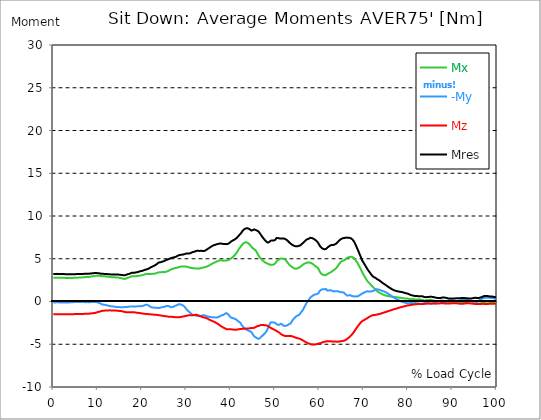
| Category |  Mx |  -My |  Mz |  Mres |
|---|---|---|---|---|
| 0.0 | 2.785 | -0.117 | -1.502 | 3.225 |
| 0.167348456675344 | 2.785 | -0.117 | -1.496 | 3.225 |
| 0.334696913350688 | 2.791 | -0.123 | -1.489 | 3.225 |
| 0.5020453700260321 | 2.791 | -0.11 | -1.489 | 3.225 |
| 0.669393826701376 | 2.791 | -0.097 | -1.496 | 3.231 |
| 0.83674228337672 | 2.791 | -0.097 | -1.496 | 3.231 |
| 1.0040907400520642 | 2.791 | -0.097 | -1.496 | 3.225 |
| 1.1621420602454444 | 2.791 | -0.104 | -1.489 | 3.225 |
| 1.3294905169207885 | 2.791 | -0.11 | -1.489 | 3.225 |
| 1.4968389735961325 | 2.791 | -0.11 | -1.489 | 3.225 |
| 1.6641874302714765 | 2.791 | -0.104 | -1.489 | 3.225 |
| 1.8315358869468206 | 2.778 | -0.104 | -1.496 | 3.218 |
| 1.9988843436221646 | 2.772 | -0.11 | -1.496 | 3.212 |
| 2.1662328002975086 | 2.772 | -0.117 | -1.489 | 3.212 |
| 2.333581256972853 | 2.772 | -0.123 | -1.483 | 3.206 |
| 2.5009297136481967 | 2.765 | -0.11 | -1.489 | 3.206 |
| 2.6682781703235405 | 2.759 | -0.104 | -1.489 | 3.199 |
| 2.8356266269988843 | 2.759 | -0.11 | -1.489 | 3.199 |
| 3.002975083674229 | 2.759 | -0.117 | -1.489 | 3.199 |
| 3.1703235403495724 | 2.759 | -0.117 | -1.489 | 3.199 |
| 3.337671997024917 | 2.759 | -0.11 | -1.489 | 3.193 |
| 3.4957233172182973 | 2.752 | -0.104 | -1.489 | 3.193 |
| 3.663071773893641 | 2.759 | -0.104 | -1.483 | 3.186 |
| 3.8304202305689854 | 2.752 | -0.097 | -1.483 | 3.186 |
| 3.997768687244329 | 2.752 | -0.084 | -1.483 | 3.186 |
| 4.165117143919673 | 2.752 | -0.078 | -1.483 | 3.186 |
| 4.332465600595017 | 2.759 | -0.078 | -1.483 | 3.193 |
| 4.499814057270361 | 2.772 | -0.071 | -1.476 | 3.199 |
| 4.667162513945706 | 2.772 | -0.071 | -1.476 | 3.199 |
| 4.834510970621049 | 2.778 | -0.071 | -1.47 | 3.199 |
| 5.001859427296393 | 2.785 | -0.071 | -1.47 | 3.199 |
| 5.169207883971737 | 2.785 | -0.065 | -1.464 | 3.206 |
| 5.336556340647081 | 2.785 | -0.058 | -1.464 | 3.206 |
| 5.503904797322425 | 2.791 | -0.052 | -1.47 | 3.212 |
| 5.671253253997769 | 2.798 | -0.052 | -1.47 | 3.218 |
| 5.82930457419115 | 2.804 | -0.058 | -1.464 | 3.218 |
| 5.996653030866494 | 2.804 | -0.058 | -1.464 | 3.218 |
| 6.164001487541838 | 2.811 | -0.065 | -1.457 | 3.218 |
| 6.331349944217181 | 2.817 | -0.065 | -1.451 | 3.218 |
| 6.498698400892526 | 2.817 | -0.065 | -1.451 | 3.225 |
| 6.66604685756787 | 2.823 | -0.065 | -1.451 | 3.225 |
| 6.833395314243213 | 2.83 | -0.071 | -1.451 | 3.231 |
| 7.000743770918558 | 2.843 | -0.071 | -1.444 | 3.238 |
| 7.168092227593902 | 2.849 | -0.078 | -1.438 | 3.238 |
| 7.335440684269246 | 2.856 | -0.078 | -1.431 | 3.238 |
| 7.50278914094459 | 2.856 | -0.078 | -1.431 | 3.244 |
| 7.6701375976199335 | 2.869 | -0.071 | -1.431 | 3.251 |
| 7.837486054295278 | 2.875 | -0.078 | -1.425 | 3.251 |
| 7.995537374488658 | 2.875 | -0.078 | -1.425 | 3.251 |
| 8.162885831164003 | 2.888 | -0.078 | -1.418 | 3.257 |
| 8.330234287839346 | 2.901 | -0.078 | -1.405 | 3.27 |
| 8.49758274451469 | 2.914 | -0.071 | -1.399 | 3.277 |
| 8.664931201190035 | 2.934 | -0.065 | -1.386 | 3.29 |
| 8.832279657865378 | 2.947 | -0.065 | -1.373 | 3.303 |
| 8.999628114540721 | 2.959 | -0.052 | -1.366 | 3.309 |
| 9.166976571216066 | 2.979 | -0.058 | -1.353 | 3.322 |
| 9.334325027891412 | 2.992 | -0.065 | -1.341 | 3.329 |
| 9.501673484566755 | 3.005 | -0.071 | -1.321 | 3.335 |
| 9.669021941242098 | 3.018 | -0.071 | -1.302 | 3.342 |
| 9.836370397917442 | 3.011 | -0.104 | -1.263 | 3.316 |
| 10.003718854592787 | 3.011 | -0.123 | -1.23 | 3.309 |
| 10.17106731126813 | 3.011 | -0.142 | -1.217 | 3.303 |
| 10.329118631461512 | 3.011 | -0.149 | -1.205 | 3.303 |
| 10.496467088136853 | 3.005 | -0.188 | -1.172 | 3.283 |
| 10.663815544812199 | 2.979 | -0.253 | -1.14 | 3.257 |
| 10.831164001487544 | 2.959 | -0.304 | -1.107 | 3.238 |
| 10.998512458162887 | 2.953 | -0.337 | -1.094 | 3.231 |
| 11.16586091483823 | 2.953 | -0.356 | -1.081 | 3.231 |
| 11.333209371513574 | 2.953 | -0.369 | -1.075 | 3.231 |
| 11.50055782818892 | 2.947 | -0.389 | -1.069 | 3.231 |
| 11.667906284864264 | 2.94 | -0.402 | -1.062 | 3.225 |
| 11.835254741539607 | 2.927 | -0.421 | -1.056 | 3.212 |
| 12.00260319821495 | 2.921 | -0.44 | -1.049 | 3.206 |
| 12.169951654890292 | 2.908 | -0.466 | -1.043 | 3.199 |
| 12.337300111565641 | 2.901 | -0.479 | -1.043 | 3.199 |
| 12.504648568240984 | 2.895 | -0.499 | -1.036 | 3.193 |
| 12.662699888434362 | 2.875 | -0.525 | -1.036 | 3.18 |
| 12.830048345109708 | 2.862 | -0.544 | -1.036 | 3.173 |
| 12.997396801785053 | 2.849 | -0.557 | -1.043 | 3.167 |
| 13.164745258460396 | 2.843 | -0.563 | -1.043 | 3.16 |
| 13.33209371513574 | 2.836 | -0.57 | -1.043 | 3.16 |
| 13.499442171811083 | 2.83 | -0.576 | -1.043 | 3.154 |
| 13.666790628486426 | 2.83 | -0.589 | -1.043 | 3.16 |
| 13.834139085161771 | 2.823 | -0.609 | -1.049 | 3.16 |
| 14.001487541837117 | 2.823 | -0.628 | -1.056 | 3.16 |
| 14.16883599851246 | 2.811 | -0.648 | -1.062 | 3.16 |
| 14.336184455187803 | 2.798 | -0.654 | -1.075 | 3.154 |
| 14.503532911863147 | 2.791 | -0.661 | -1.081 | 3.154 |
| 14.670881368538492 | 2.791 | -0.648 | -1.088 | 3.147 |
| 14.828932688731873 | 2.778 | -0.661 | -1.094 | 3.141 |
| 14.996281145407215 | 2.759 | -0.667 | -1.107 | 3.134 |
| 15.163629602082558 | 2.739 | -0.667 | -1.114 | 3.121 |
| 15.330978058757903 | 2.72 | -0.667 | -1.127 | 3.108 |
| 15.498326515433247 | 2.7 | -0.667 | -1.14 | 3.095 |
| 15.665674972108594 | 2.675 | -0.667 | -1.159 | 3.089 |
| 15.833023428783937 | 2.655 | -0.661 | -1.185 | 3.076 |
| 16.00037188545928 | 2.642 | -0.654 | -1.211 | 3.063 |
| 16.167720342134626 | 2.636 | -0.648 | -1.23 | 3.07 |
| 16.335068798809967 | 2.662 | -0.654 | -1.243 | 3.095 |
| 16.502417255485312 | 2.713 | -0.635 | -1.25 | 3.134 |
| 16.669765712160658 | 2.765 | -0.635 | -1.256 | 3.18 |
| 16.837114168836 | 2.791 | -0.615 | -1.263 | 3.199 |
| 17.004462625511344 | 2.804 | -0.602 | -1.263 | 3.212 |
| 17.16251394570472 | 2.836 | -0.596 | -1.263 | 3.238 |
| 17.32986240238007 | 2.875 | -0.596 | -1.263 | 3.277 |
| 17.497210859055414 | 2.914 | -0.589 | -1.256 | 3.316 |
| 17.664559315730756 | 2.947 | -0.596 | -1.25 | 3.348 |
| 17.8319077724061 | 2.947 | -0.596 | -1.25 | 3.354 |
| 17.999256229081443 | 2.947 | -0.589 | -1.25 | 3.354 |
| 18.166604685756788 | 2.94 | -0.57 | -1.256 | 3.348 |
| 18.333953142432133 | 2.947 | -0.576 | -1.269 | 3.367 |
| 18.501301599107478 | 2.959 | -0.583 | -1.289 | 3.393 |
| 18.668650055782823 | 2.966 | -0.583 | -1.302 | 3.413 |
| 18.835998512458165 | 2.972 | -0.563 | -1.302 | 3.419 |
| 19.00334696913351 | 2.979 | -0.55 | -1.315 | 3.432 |
| 19.170695425808855 | 2.998 | -0.55 | -1.328 | 3.458 |
| 19.338043882484197 | 3.018 | -0.557 | -1.347 | 3.497 |
| 19.496095202677576 | 3.031 | -0.563 | -1.36 | 3.529 |
| 19.66344365935292 | 3.044 | -0.55 | -1.366 | 3.549 |
| 19.830792116028263 | 3.057 | -0.537 | -1.379 | 3.568 |
| 19.998140572703612 | 3.07 | -0.525 | -1.392 | 3.581 |
| 20.165489029378953 | 3.083 | -0.518 | -1.405 | 3.607 |
| 20.3328374860543 | 3.115 | -0.499 | -1.425 | 3.639 |
| 20.500185942729644 | 3.141 | -0.447 | -1.444 | 3.665 |
| 20.667534399404985 | 3.186 | -0.408 | -1.444 | 3.704 |
| 20.83488285608033 | 3.199 | -0.389 | -1.457 | 3.73 |
| 21.002231312755672 | 3.212 | -0.369 | -1.464 | 3.756 |
| 21.16957976943102 | 3.225 | -0.369 | -1.47 | 3.769 |
| 21.336928226106362 | 3.225 | -0.414 | -1.476 | 3.808 |
| 21.504276682781704 | 3.225 | -0.466 | -1.489 | 3.847 |
| 21.67162513945705 | 3.225 | -0.531 | -1.489 | 3.898 |
| 21.82967645965043 | 3.231 | -0.596 | -1.489 | 3.95 |
| 21.997024916325774 | 3.225 | -0.661 | -1.502 | 4.009 |
| 22.16437337300112 | 3.231 | -0.706 | -1.509 | 4.06 |
| 22.33172182967646 | 3.238 | -0.693 | -1.515 | 4.08 |
| 22.499070286351806 | 3.244 | -0.686 | -1.528 | 4.112 |
| 22.666418743027148 | 3.244 | -0.719 | -1.541 | 4.164 |
| 22.833767199702496 | 3.244 | -0.745 | -1.554 | 4.209 |
| 23.00111565637784 | 3.27 | -0.745 | -1.561 | 4.261 |
| 23.168464113053183 | 3.309 | -0.738 | -1.561 | 4.319 |
| 23.335812569728528 | 3.348 | -0.725 | -1.561 | 4.371 |
| 23.50316102640387 | 3.374 | -0.751 | -1.58 | 4.455 |
| 23.670509483079215 | 3.393 | -0.771 | -1.6 | 4.533 |
| 23.83785793975456 | 3.413 | -0.758 | -1.606 | 4.572 |
| 23.995909259947936 | 3.419 | -0.738 | -1.612 | 4.578 |
| 24.163257716623285 | 3.419 | -0.712 | -1.625 | 4.591 |
| 24.330606173298627 | 3.419 | -0.68 | -1.638 | 4.611 |
| 24.49795462997397 | 3.432 | -0.654 | -1.658 | 4.63 |
| 24.665303086649313 | 3.445 | -0.654 | -1.677 | 4.676 |
| 24.83265154332466 | 3.432 | -0.641 | -1.69 | 4.708 |
| 25.0 | 3.426 | -0.635 | -1.71 | 4.734 |
| 25.167348456675345 | 3.445 | -0.609 | -1.716 | 4.773 |
| 25.334696913350694 | 3.465 | -0.544 | -1.716 | 4.818 |
| 25.502045370026035 | 3.49 | -0.518 | -1.729 | 4.863 |
| 25.669393826701377 | 3.523 | -0.531 | -1.742 | 4.902 |
| 25.836742283376722 | 3.555 | -0.525 | -1.761 | 4.922 |
| 26.004090740052067 | 3.594 | -0.531 | -1.781 | 4.941 |
| 26.17143919672741 | 3.633 | -0.563 | -1.774 | 4.961 |
| 26.329490516920792 | 3.704 | -0.628 | -1.787 | 5.038 |
| 26.49683897359613 | 3.75 | -0.661 | -1.794 | 5.071 |
| 26.66418743027148 | 3.769 | -0.68 | -1.794 | 5.084 |
| 26.831535886946828 | 3.795 | -0.686 | -1.794 | 5.116 |
| 26.998884343622166 | 3.834 | -0.641 | -1.8 | 5.148 |
| 27.166232800297514 | 3.866 | -0.57 | -1.82 | 5.161 |
| 27.333581256972852 | 3.892 | -0.525 | -1.826 | 5.181 |
| 27.5009297136482 | 3.911 | -0.492 | -1.833 | 5.207 |
| 27.668278170323543 | 3.931 | -0.479 | -1.839 | 5.232 |
| 27.835626626998888 | 3.957 | -0.46 | -1.839 | 5.284 |
| 28.002975083674233 | 3.963 | -0.389 | -1.839 | 5.336 |
| 28.170323540349575 | 3.989 | -0.343 | -1.839 | 5.381 |
| 28.33767199702492 | 4.022 | -0.317 | -1.833 | 5.42 |
| 28.50502045370026 | 4.054 | -0.311 | -1.826 | 5.44 |
| 28.663071773893645 | 4.073 | -0.33 | -1.813 | 5.453 |
| 28.830420230568986 | 4.086 | -0.356 | -1.8 | 5.466 |
| 28.99776868724433 | 4.099 | -0.402 | -1.787 | 5.479 |
| 29.165117143919673 | 4.106 | -0.447 | -1.768 | 5.492 |
| 29.33246560059502 | 4.099 | -0.486 | -1.748 | 5.498 |
| 29.499814057270367 | 4.099 | -0.576 | -1.729 | 5.524 |
| 29.66716251394571 | 4.099 | -0.648 | -1.71 | 5.55 |
| 29.834510970621054 | 4.086 | -0.751 | -1.69 | 5.569 |
| 30.00185942729639 | 4.073 | -0.881 | -1.677 | 5.621 |
| 30.169207883971744 | 4.054 | -0.984 | -1.658 | 5.634 |
| 30.33655634064708 | 4.041 | -1.081 | -1.632 | 5.628 |
| 30.50390479732243 | 4.009 | -1.179 | -1.612 | 5.615 |
| 30.671253253997772 | 3.983 | -1.237 | -1.6 | 5.608 |
| 30.829304574191156 | 3.957 | -1.289 | -1.593 | 5.621 |
| 30.996653030866494 | 3.931 | -1.379 | -1.6 | 5.673 |
| 31.164001487541842 | 3.911 | -1.47 | -1.606 | 5.725 |
| 31.331349944217187 | 3.905 | -1.541 | -1.606 | 5.764 |
| 31.498698400892525 | 3.898 | -1.574 | -1.6 | 5.789 |
| 31.666046857567874 | 3.886 | -1.6 | -1.587 | 5.809 |
| 31.833395314243212 | 3.879 | -1.625 | -1.587 | 5.841 |
| 32.00074377091856 | 3.873 | -1.612 | -1.567 | 5.861 |
| 32.1680922275939 | 3.873 | -1.632 | -1.554 | 5.887 |
| 32.33544068426925 | 3.873 | -1.671 | -1.548 | 5.925 |
| 32.50278914094459 | 3.86 | -1.69 | -1.587 | 5.932 |
| 32.670137597619934 | 3.847 | -1.697 | -1.632 | 5.932 |
| 32.83748605429528 | 3.86 | -1.664 | -1.671 | 5.919 |
| 33.004834510970625 | 3.873 | -1.651 | -1.703 | 5.912 |
| 33.162885831164004 | 3.892 | -1.664 | -1.736 | 5.919 |
| 33.33023428783935 | 3.911 | -1.71 | -1.748 | 5.938 |
| 33.497582744514695 | 3.937 | -1.671 | -1.787 | 5.925 |
| 33.664931201190036 | 3.957 | -1.606 | -1.826 | 5.899 |
| 33.83227965786538 | 3.976 | -1.606 | -1.846 | 5.906 |
| 33.99962811454073 | 3.996 | -1.6 | -1.872 | 5.906 |
| 34.16697657121607 | 4.015 | -1.619 | -1.891 | 5.938 |
| 34.33432502789141 | 4.034 | -1.658 | -1.91 | 5.984 |
| 34.50167348456676 | 4.067 | -1.703 | -1.943 | 6.042 |
| 34.6690219412421 | 4.099 | -1.736 | -1.975 | 6.094 |
| 34.83637039791744 | 4.138 | -1.748 | -2.033 | 6.139 |
| 35.00371885459279 | 4.183 | -1.774 | -2.072 | 6.21 |
| 35.17106731126814 | 4.229 | -1.781 | -2.118 | 6.256 |
| 35.338415767943474 | 4.274 | -1.8 | -2.156 | 6.32 |
| 35.49646708813686 | 4.326 | -1.82 | -2.195 | 6.385 |
| 35.6638155448122 | 4.371 | -1.833 | -2.241 | 6.443 |
| 35.831164001487544 | 4.423 | -1.846 | -2.286 | 6.495 |
| 35.998512458162885 | 4.468 | -1.852 | -2.318 | 6.541 |
| 36.165860914838234 | 4.514 | -1.852 | -2.357 | 6.579 |
| 36.333209371513576 | 4.553 | -1.859 | -2.39 | 6.605 |
| 36.50055782818892 | 4.591 | -1.865 | -2.428 | 6.625 |
| 36.667906284864266 | 4.63 | -1.865 | -2.48 | 6.657 |
| 36.83525474153961 | 4.676 | -1.878 | -2.532 | 6.69 |
| 37.002603198214956 | 4.714 | -1.865 | -2.59 | 6.722 |
| 37.1699516548903 | 4.747 | -1.826 | -2.642 | 6.741 |
| 37.337300111565646 | 4.779 | -1.787 | -2.7 | 6.761 |
| 37.50464856824098 | 4.805 | -1.768 | -2.759 | 6.774 |
| 37.66269988843437 | 4.831 | -1.703 | -2.83 | 6.78 |
| 37.83004834510971 | 4.837 | -1.658 | -2.888 | 6.78 |
| 37.99739680178505 | 4.825 | -1.606 | -2.94 | 6.761 |
| 38.16474525846039 | 4.786 | -1.593 | -3.005 | 6.754 |
| 38.33209371513574 | 4.76 | -1.58 | -3.044 | 6.735 |
| 38.49944217181109 | 4.766 | -1.528 | -3.076 | 6.735 |
| 38.666790628486424 | 4.792 | -1.444 | -3.128 | 6.715 |
| 38.83413908516178 | 4.799 | -1.373 | -3.18 | 6.696 |
| 39.001487541837115 | 4.799 | -1.36 | -3.225 | 6.709 |
| 39.16883599851246 | 4.812 | -1.373 | -3.238 | 6.709 |
| 39.336184455187805 | 4.825 | -1.457 | -3.251 | 6.728 |
| 39.503532911863154 | 4.844 | -1.535 | -3.264 | 6.754 |
| 39.670881368538495 | 4.896 | -1.645 | -3.257 | 6.826 |
| 39.83822982521384 | 4.967 | -1.768 | -3.238 | 6.923 |
| 39.996281145407224 | 5.019 | -1.846 | -3.238 | 6.981 |
| 40.163629602082565 | 5.077 | -1.897 | -3.251 | 7.039 |
| 40.33097805875791 | 5.142 | -1.936 | -3.27 | 7.091 |
| 40.498326515433256 | 5.213 | -1.949 | -3.283 | 7.136 |
| 40.6656749721086 | 5.291 | -1.975 | -3.283 | 7.182 |
| 40.83302342878393 | 5.381 | -2.014 | -3.296 | 7.24 |
| 41.00037188545929 | 5.466 | -2.027 | -3.303 | 7.285 |
| 41.16772034213463 | 5.569 | -2.079 | -3.309 | 7.35 |
| 41.33506879880997 | 5.692 | -2.15 | -3.296 | 7.421 |
| 41.50241725548531 | 5.828 | -2.221 | -3.283 | 7.506 |
| 41.66976571216066 | 5.971 | -2.292 | -3.257 | 7.609 |
| 41.837114168836 | 6.113 | -2.357 | -3.238 | 7.706 |
| 42.004462625511344 | 6.236 | -2.441 | -3.231 | 7.803 |
| 42.17181108218669 | 6.353 | -2.474 | -3.212 | 7.881 |
| 42.32986240238007 | 6.463 | -2.571 | -3.206 | 7.985 |
| 42.497210859055414 | 6.586 | -2.765 | -3.212 | 8.127 |
| 42.66455931573076 | 6.703 | -2.875 | -3.199 | 8.257 |
| 42.831907772406105 | 6.78 | -2.979 | -3.199 | 8.347 |
| 42.999256229081446 | 6.838 | -3.057 | -3.193 | 8.419 |
| 43.16660468575679 | 6.89 | -3.121 | -3.186 | 8.49 |
| 43.33395314243214 | 6.936 | -3.173 | -3.18 | 8.542 |
| 43.50130159910748 | 6.936 | -3.251 | -3.173 | 8.561 |
| 43.66865005578282 | 6.903 | -3.316 | -3.167 | 8.568 |
| 43.83599851245817 | 6.858 | -3.374 | -3.154 | 8.555 |
| 44.00334696913351 | 6.806 | -3.413 | -3.154 | 8.535 |
| 44.17069542580886 | 6.728 | -3.445 | -3.141 | 8.49 |
| 44.3380438824842 | 6.644 | -3.478 | -3.128 | 8.432 |
| 44.49609520267758 | 6.534 | -3.51 | -3.115 | 8.36 |
| 44.66344365935292 | 6.411 | -3.542 | -3.108 | 8.296 |
| 44.83079211602827 | 6.314 | -3.678 | -3.108 | 8.315 |
| 44.99814057270361 | 6.23 | -3.834 | -3.108 | 8.354 |
| 45.16548902937895 | 6.139 | -3.989 | -3.102 | 8.406 |
| 45.332837486054295 | 6.107 | -4.093 | -3.07 | 8.438 |
| 45.500185942729644 | 6.048 | -4.151 | -3.031 | 8.419 |
| 45.66753439940499 | 5.951 | -4.19 | -2.979 | 8.354 |
| 45.83488285608033 | 5.802 | -4.255 | -2.927 | 8.315 |
| 46.00223131275568 | 5.647 | -4.332 | -2.875 | 8.276 |
| 46.16957976943102 | 5.492 | -4.358 | -2.875 | 8.224 |
| 46.336928226106366 | 5.343 | -4.371 | -2.869 | 8.166 |
| 46.50427668278171 | 5.194 | -4.332 | -2.862 | 8.062 |
| 46.671625139457056 | 5.148 | -4.229 | -2.765 | 7.913 |
| 46.829676459650436 | 5.025 | -4.157 | -2.746 | 7.784 |
| 46.99702491632577 | 4.915 | -4.08 | -2.746 | 7.661 |
| 47.16437337300112 | 4.818 | -4.002 | -2.746 | 7.544 |
| 47.33172182967646 | 4.74 | -3.905 | -2.746 | 7.428 |
| 47.49907028635181 | 4.669 | -3.827 | -2.752 | 7.318 |
| 47.66641874302716 | 4.604 | -3.75 | -2.765 | 7.214 |
| 47.83376719970249 | 4.546 | -3.659 | -2.778 | 7.117 |
| 48.001115656377834 | 4.507 | -3.542 | -2.791 | 7.026 |
| 48.16846411305319 | 4.462 | -3.393 | -2.817 | 6.949 |
| 48.33581256972853 | 4.417 | -3.231 | -2.856 | 6.897 |
| 48.50316102640387 | 4.391 | -3.031 | -2.901 | 6.897 |
| 48.67050948307921 | 4.345 | -2.804 | -2.959 | 6.936 |
| 48.837857939754564 | 4.306 | -2.61 | -3.018 | 7.026 |
| 49.005206396429905 | 4.281 | -2.461 | -3.076 | 7.104 |
| 49.163257716623285 | 4.287 | -2.428 | -3.121 | 7.117 |
| 49.33060617329863 | 4.274 | -2.428 | -3.16 | 7.136 |
| 49.49795462997397 | 4.287 | -2.435 | -3.206 | 7.136 |
| 49.66530308664932 | 4.326 | -2.448 | -3.251 | 7.13 |
| 49.832651543324666 | 4.365 | -2.5 | -3.29 | 7.169 |
| 50.0 | 4.429 | -2.487 | -3.348 | 7.188 |
| 50.16734845667534 | 4.54 | -2.551 | -3.393 | 7.292 |
| 50.33469691335069 | 4.669 | -2.649 | -3.439 | 7.415 |
| 50.50204537002604 | 4.76 | -2.707 | -3.49 | 7.447 |
| 50.66939382670139 | 4.85 | -2.713 | -3.542 | 7.415 |
| 50.836742283376715 | 4.922 | -2.7 | -3.614 | 7.402 |
| 51.00409074005207 | 4.954 | -2.72 | -3.659 | 7.382 |
| 51.17143919672741 | 5.012 | -2.668 | -3.737 | 7.395 |
| 51.32949051692079 | 5.032 | -2.61 | -3.808 | 7.376 |
| 51.496838973596134 | 5.025 | -2.597 | -3.866 | 7.37 |
| 51.66418743027148 | 5.012 | -2.687 | -3.911 | 7.382 |
| 51.831535886946824 | 5.012 | -2.817 | -3.944 | 7.395 |
| 51.99888434362217 | 4.999 | -2.882 | -3.983 | 7.376 |
| 52.16623280029752 | 4.961 | -2.862 | -4.022 | 7.344 |
| 52.33358125697285 | 4.896 | -2.817 | -4.047 | 7.298 |
| 52.5009297136482 | 4.792 | -2.83 | -4.047 | 7.253 |
| 52.668278170323546 | 4.676 | -2.843 | -4.041 | 7.195 |
| 52.835626626998895 | 4.559 | -2.772 | -4.041 | 7.11 |
| 53.00297508367424 | 4.449 | -2.707 | -4.034 | 7.026 |
| 53.17032354034958 | 4.332 | -2.642 | -4.028 | 6.936 |
| 53.33767199702492 | 4.235 | -2.603 | -4.022 | 6.858 |
| 53.50502045370027 | 4.19 | -2.577 | -4.028 | 6.793 |
| 53.663071773893655 | 4.112 | -2.441 | -4.041 | 6.715 |
| 53.83042023056899 | 4.041 | -2.299 | -4.06 | 6.644 |
| 53.99776868724433 | 3.976 | -2.176 | -4.093 | 6.592 |
| 54.16511714391967 | 3.911 | -2.053 | -4.125 | 6.547 |
| 54.33246560059503 | 3.879 | -1.975 | -4.151 | 6.515 |
| 54.49981405727037 | 3.847 | -1.884 | -4.19 | 6.482 |
| 54.667162513945705 | 3.834 | -1.787 | -4.229 | 6.45 |
| 54.834510970621054 | 3.84 | -1.716 | -4.255 | 6.437 |
| 55.0018594272964 | 3.86 | -1.671 | -4.274 | 6.45 |
| 55.169207883971744 | 3.886 | -1.632 | -4.3 | 6.476 |
| 55.336556340647086 | 3.937 | -1.587 | -4.319 | 6.508 |
| 55.50390479732243 | 3.996 | -1.548 | -4.339 | 6.547 |
| 55.671253253997776 | 4.047 | -1.418 | -4.384 | 6.554 |
| 55.83860171067312 | 4.106 | -1.276 | -4.423 | 6.612 |
| 55.9966530308665 | 4.177 | -1.179 | -4.468 | 6.703 |
| 56.16400148754184 | 4.255 | -1.081 | -4.514 | 6.774 |
| 56.33134994421718 | 4.319 | -0.945 | -4.559 | 6.845 |
| 56.498698400892536 | 4.384 | -0.79 | -4.611 | 6.942 |
| 56.66604685756788 | 4.436 | -0.609 | -4.669 | 7.026 |
| 56.83339531424321 | 4.468 | -0.447 | -4.714 | 7.117 |
| 57.00074377091856 | 4.494 | -0.285 | -4.766 | 7.195 |
| 57.16809222759391 | 4.527 | -0.136 | -4.812 | 7.266 |
| 57.33544068426925 | 4.559 | -0.013 | -4.857 | 7.292 |
| 57.5027891409446 | 4.565 | 0.104 | -4.883 | 7.311 |
| 57.670137597619934 | 4.559 | 0.227 | -4.922 | 7.363 |
| 57.83748605429528 | 4.546 | 0.363 | -4.954 | 7.408 |
| 58.004834510970625 | 4.533 | 0.473 | -4.986 | 7.447 |
| 58.16288583116401 | 4.488 | 0.544 | -5.012 | 7.441 |
| 58.330234287839346 | 4.455 | 0.602 | -5.032 | 7.421 |
| 58.497582744514695 | 4.404 | 0.673 | -5.045 | 7.389 |
| 58.66493120119004 | 4.326 | 0.738 | -5.045 | 7.344 |
| 58.832279657865385 | 4.248 | 0.797 | -5.038 | 7.298 |
| 58.999628114540734 | 4.177 | 0.822 | -5.032 | 7.24 |
| 59.16697657121607 | 4.125 | 0.822 | -5.012 | 7.182 |
| 59.33432502789142 | 4.054 | 0.861 | -4.993 | 7.098 |
| 59.50167348456676 | 4.009 | 0.881 | -4.961 | 7.013 |
| 59.66902194124211 | 3.924 | 0.887 | -4.941 | 6.91 |
| 59.83637039791745 | 3.788 | 0.971 | -4.915 | 6.767 |
| 60.00371885459278 | 3.607 | 1.146 | -4.902 | 6.612 |
| 60.17106731126813 | 3.439 | 1.289 | -4.883 | 6.469 |
| 60.33841576794349 | 3.309 | 1.353 | -4.85 | 6.359 |
| 60.49646708813685 | 3.218 | 1.386 | -4.825 | 6.275 |
| 60.6638155448122 | 3.154 | 1.412 | -4.792 | 6.204 |
| 60.831164001487544 | 3.115 | 1.438 | -4.753 | 6.159 |
| 60.99851245816289 | 3.095 | 1.438 | -4.727 | 6.126 |
| 61.16586091483824 | 3.076 | 1.444 | -4.708 | 6.113 |
| 61.333209371513576 | 3.07 | 1.444 | -4.689 | 6.113 |
| 61.50055782818892 | 3.076 | 1.451 | -4.669 | 6.146 |
| 61.667906284864266 | 3.147 | 1.353 | -4.656 | 6.23 |
| 61.835254741539615 | 3.225 | 1.276 | -4.65 | 6.314 |
| 62.002603198214956 | 3.27 | 1.282 | -4.643 | 6.392 |
| 62.16995165489029 | 3.309 | 1.302 | -4.643 | 6.443 |
| 62.33730011156564 | 3.354 | 1.308 | -4.643 | 6.502 |
| 62.504648568240995 | 3.406 | 1.308 | -4.65 | 6.567 |
| 62.67199702491633 | 3.452 | 1.302 | -4.669 | 6.605 |
| 62.83004834510971 | 3.503 | 1.269 | -4.682 | 6.612 |
| 62.99739680178505 | 3.568 | 1.224 | -4.676 | 6.605 |
| 63.1647452584604 | 3.626 | 1.192 | -4.676 | 6.618 |
| 63.33209371513575 | 3.691 | 1.172 | -4.669 | 6.644 |
| 63.4994421718111 | 3.75 | 1.185 | -4.676 | 6.677 |
| 63.666790628486424 | 3.834 | 1.192 | -4.682 | 6.709 |
| 63.83413908516177 | 3.918 | 1.198 | -4.701 | 6.774 |
| 64.00148754183712 | 4.028 | 1.217 | -4.708 | 6.871 |
| 64.16883599851248 | 4.151 | 1.198 | -4.701 | 6.962 |
| 64.3361844551878 | 4.287 | 1.146 | -4.689 | 7.039 |
| 64.50353291186315 | 4.41 | 1.146 | -4.682 | 7.136 |
| 64.6708813685385 | 4.52 | 1.133 | -4.676 | 7.214 |
| 64.83822982521384 | 4.617 | 1.081 | -4.656 | 7.279 |
| 65.00557828188919 | 4.689 | 1.062 | -4.63 | 7.337 |
| 65.16362960208257 | 4.74 | 1.075 | -4.611 | 7.376 |
| 65.3309780587579 | 4.773 | 1.069 | -4.604 | 7.402 |
| 65.49832651543326 | 4.792 | 1.062 | -4.591 | 7.421 |
| 65.6656749721086 | 4.844 | 0.984 | -4.572 | 7.434 |
| 65.83302342878395 | 4.915 | 0.887 | -4.533 | 7.447 |
| 66.00037188545929 | 4.999 | 0.771 | -4.481 | 7.46 |
| 66.16772034213463 | 5.064 | 0.706 | -4.423 | 7.48 |
| 66.33506879880998 | 5.109 | 0.699 | -4.352 | 7.46 |
| 66.50241725548531 | 5.148 | 0.699 | -4.281 | 7.447 |
| 66.66976571216065 | 5.181 | 0.732 | -4.216 | 7.447 |
| 66.83711416883601 | 5.207 | 0.758 | -4.145 | 7.441 |
| 67.00446262551135 | 5.226 | 0.725 | -4.06 | 7.421 |
| 67.1718110821867 | 5.232 | 0.68 | -3.97 | 7.382 |
| 67.32986240238007 | 5.22 | 0.648 | -3.873 | 7.318 |
| 67.49721085905541 | 5.194 | 0.628 | -3.769 | 7.24 |
| 67.66455931573076 | 5.148 | 0.609 | -3.659 | 7.143 |
| 67.83190777240611 | 5.071 | 0.596 | -3.536 | 7.007 |
| 67.99925622908145 | 4.967 | 0.602 | -3.413 | 6.845 |
| 68.16660468575678 | 4.85 | 0.602 | -3.283 | 6.664 |
| 68.33395314243214 | 4.734 | 0.589 | -3.154 | 6.469 |
| 68.50130159910749 | 4.598 | 0.589 | -3.024 | 6.262 |
| 68.66865005578282 | 4.462 | 0.589 | -2.908 | 6.068 |
| 68.83599851245816 | 4.313 | 0.648 | -2.791 | 5.867 |
| 69.00334696913352 | 4.138 | 0.706 | -2.675 | 5.647 |
| 69.17069542580886 | 3.97 | 0.764 | -2.564 | 5.44 |
| 69.3380438824842 | 3.801 | 0.803 | -2.467 | 5.239 |
| 69.50539233915956 | 3.62 | 0.868 | -2.377 | 5.019 |
| 69.66344365935292 | 3.432 | 0.945 | -2.292 | 4.805 |
| 69.83079211602826 | 3.27 | 0.984 | -2.241 | 4.656 |
| 69.99814057270362 | 3.121 | 1.004 | -2.215 | 4.527 |
| 70.16548902937896 | 2.966 | 1.049 | -2.15 | 4.378 |
| 70.33283748605429 | 2.817 | 1.094 | -2.098 | 4.235 |
| 70.50018594272964 | 2.668 | 1.146 | -2.046 | 4.086 |
| 70.667534399405 | 2.519 | 1.179 | -1.995 | 3.944 |
| 70.83488285608033 | 2.396 | 1.192 | -1.949 | 3.808 |
| 71.00223131275568 | 2.292 | 1.185 | -1.878 | 3.665 |
| 71.16957976943102 | 2.215 | 1.159 | -1.82 | 3.542 |
| 71.33692822610637 | 2.124 | 1.159 | -1.774 | 3.432 |
| 71.50427668278171 | 2.027 | 1.172 | -1.729 | 3.316 |
| 71.67162513945706 | 1.923 | 1.192 | -1.69 | 3.193 |
| 71.8389735961324 | 1.826 | 1.205 | -1.651 | 3.076 |
| 71.99702491632577 | 1.742 | 1.211 | -1.612 | 2.966 |
| 72.16437337300113 | 1.658 | 1.23 | -1.587 | 2.882 |
| 72.33172182967647 | 1.574 | 1.282 | -1.574 | 2.836 |
| 72.49907028635181 | 1.489 | 1.366 | -1.58 | 2.823 |
| 72.66641874302715 | 1.386 | 1.418 | -1.574 | 2.772 |
| 72.8337671997025 | 1.302 | 1.425 | -1.548 | 2.694 |
| 73.00111565637783 | 1.224 | 1.425 | -1.522 | 2.623 |
| 73.16846411305319 | 1.159 | 1.418 | -1.502 | 2.577 |
| 73.33581256972853 | 1.101 | 1.405 | -1.489 | 2.532 |
| 73.50316102640387 | 1.043 | 1.379 | -1.464 | 2.474 |
| 73.67050948307921 | 0.991 | 1.36 | -1.444 | 2.415 |
| 73.83785793975457 | 0.958 | 1.321 | -1.425 | 2.357 |
| 74.00520639642991 | 0.907 | 1.289 | -1.392 | 2.286 |
| 74.16325771662328 | 0.861 | 1.256 | -1.36 | 2.215 |
| 74.33060617329863 | 0.816 | 1.217 | -1.328 | 2.144 |
| 74.49795462997398 | 0.777 | 1.192 | -1.302 | 2.092 |
| 74.66530308664932 | 0.745 | 1.166 | -1.276 | 2.04 |
| 74.83265154332466 | 0.719 | 1.127 | -1.25 | 1.982 |
| 75.00000000000001 | 0.693 | 1.081 | -1.217 | 1.923 |
| 75.16734845667534 | 0.673 | 1.023 | -1.192 | 1.859 |
| 75.3346969133507 | 0.648 | 0.971 | -1.159 | 1.794 |
| 75.50204537002605 | 0.628 | 0.913 | -1.133 | 1.729 |
| 75.66939382670138 | 0.615 | 0.855 | -1.107 | 1.671 |
| 75.83674228337672 | 0.602 | 0.797 | -1.075 | 1.612 |
| 76.00409074005208 | 0.596 | 0.732 | -1.049 | 1.561 |
| 76.17143919672742 | 0.576 | 0.686 | -1.023 | 1.502 |
| 76.33878765340276 | 0.557 | 0.635 | -0.997 | 1.451 |
| 76.49683897359614 | 0.55 | 0.57 | -0.965 | 1.399 |
| 76.66418743027148 | 0.544 | 0.505 | -0.933 | 1.36 |
| 76.83153588694682 | 0.531 | 0.46 | -0.907 | 1.321 |
| 76.99888434362218 | 0.518 | 0.414 | -0.881 | 1.289 |
| 77.16623280029752 | 0.505 | 0.363 | -0.855 | 1.256 |
| 77.33358125697285 | 0.492 | 0.311 | -0.829 | 1.23 |
| 77.5009297136482 | 0.492 | 0.259 | -0.809 | 1.217 |
| 77.66827817032356 | 0.473 | 0.22 | -0.784 | 1.198 |
| 77.83562662699889 | 0.466 | 0.175 | -0.758 | 1.179 |
| 78.00297508367423 | 0.46 | 0.117 | -0.732 | 1.159 |
| 78.17032354034959 | 0.447 | 0.078 | -0.699 | 1.133 |
| 78.33767199702493 | 0.44 | 0.039 | -0.68 | 1.127 |
| 78.50502045370027 | 0.427 | -0.006 | -0.654 | 1.114 |
| 78.67236891037561 | 0.414 | -0.045 | -0.628 | 1.101 |
| 78.83042023056899 | 0.395 | -0.065 | -0.609 | 1.081 |
| 78.99776868724433 | 0.369 | -0.078 | -0.589 | 1.049 |
| 79.16511714391969 | 0.363 | -0.097 | -0.563 | 1.017 |
| 79.33246560059503 | 0.363 | -0.123 | -0.537 | 0.991 |
| 79.49981405727036 | 0.363 | -0.162 | -0.518 | 0.965 |
| 79.66716251394571 | 0.363 | -0.201 | -0.492 | 0.952 |
| 79.83451097062107 | 0.356 | -0.214 | -0.473 | 0.939 |
| 80.00185942729641 | 0.337 | -0.214 | -0.46 | 0.907 |
| 80.16920788397174 | 0.311 | -0.201 | -0.447 | 0.868 |
| 80.33655634064709 | 0.291 | -0.201 | -0.434 | 0.822 |
| 80.50390479732243 | 0.278 | -0.188 | -0.421 | 0.784 |
| 80.67125325399778 | 0.272 | -0.175 | -0.408 | 0.751 |
| 80.83860171067312 | 0.272 | -0.181 | -0.389 | 0.732 |
| 80.99665303086651 | 0.278 | -0.201 | -0.369 | 0.712 |
| 81.16400148754184 | 0.285 | -0.227 | -0.356 | 0.693 |
| 81.3313499442172 | 0.272 | -0.207 | -0.35 | 0.673 |
| 81.49869840089255 | 0.253 | -0.181 | -0.343 | 0.641 |
| 81.66604685756786 | 0.233 | -0.175 | -0.337 | 0.628 |
| 81.83339531424322 | 0.24 | -0.194 | -0.317 | 0.622 |
| 82.00074377091858 | 0.227 | -0.181 | -0.317 | 0.641 |
| 82.16809222759392 | 0.24 | -0.201 | -0.304 | 0.635 |
| 82.33544068426926 | 0.253 | -0.233 | -0.291 | 0.622 |
| 82.50278914094459 | 0.259 | -0.266 | -0.291 | 0.609 |
| 82.67013759761994 | 0.253 | -0.278 | -0.291 | 0.609 |
| 82.83748605429528 | 0.233 | -0.278 | -0.291 | 0.622 |
| 83.00483451097062 | 0.214 | -0.278 | -0.291 | 0.628 |
| 83.17218296764597 | 0.188 | -0.266 | -0.291 | 0.622 |
| 83.33023428783935 | 0.162 | -0.246 | -0.291 | 0.596 |
| 83.4975827445147 | 0.136 | -0.214 | -0.291 | 0.563 |
| 83.66493120119004 | 0.123 | -0.181 | -0.278 | 0.525 |
| 83.83227965786537 | 0.117 | -0.155 | -0.272 | 0.505 |
| 83.99962811454073 | 0.123 | -0.149 | -0.266 | 0.505 |
| 84.16697657121607 | 0.136 | -0.155 | -0.259 | 0.512 |
| 84.33432502789142 | 0.149 | -0.162 | -0.246 | 0.518 |
| 84.50167348456677 | 0.168 | -0.181 | -0.24 | 0.525 |
| 84.6690219412421 | 0.181 | -0.201 | -0.227 | 0.537 |
| 84.83637039791745 | 0.201 | -0.227 | -0.22 | 0.55 |
| 85.0037188545928 | 0.207 | -0.253 | -0.22 | 0.55 |
| 85.17106731126813 | 0.194 | -0.266 | -0.22 | 0.544 |
| 85.33841576794349 | 0.175 | -0.253 | -0.22 | 0.544 |
| 85.50576422461883 | 0.149 | -0.233 | -0.227 | 0.544 |
| 85.66381554481221 | 0.117 | -0.207 | -0.233 | 0.531 |
| 85.83116400148755 | 0.091 | -0.168 | -0.24 | 0.512 |
| 85.99851245816289 | 0.058 | -0.123 | -0.246 | 0.486 |
| 86.16586091483823 | 0.026 | -0.078 | -0.253 | 0.453 |
| 86.33320937151358 | 0.013 | -0.039 | -0.253 | 0.434 |
| 86.50055782818893 | 0.006 | -0.006 | -0.246 | 0.427 |
| 86.66790628486427 | 0.013 | 0.006 | -0.246 | 0.421 |
| 86.83525474153961 | 0.032 | 0.019 | -0.24 | 0.414 |
| 87.00260319821496 | 0.052 | 0.013 | -0.227 | 0.408 |
| 87.16995165489031 | 0.071 | 0 | -0.22 | 0.408 |
| 87.33730011156564 | 0.091 | -0.026 | -0.214 | 0.414 |
| 87.504648568241 | 0.117 | -0.058 | -0.207 | 0.434 |
| 87.67199702491634 | 0.123 | -0.084 | -0.201 | 0.453 |
| 87.83004834510972 | 0.11 | -0.097 | -0.207 | 0.453 |
| 87.99739680178506 | 0.091 | -0.097 | -0.214 | 0.453 |
| 88.1647452584604 | 0.071 | -0.091 | -0.22 | 0.453 |
| 88.33209371513574 | 0.039 | -0.071 | -0.227 | 0.453 |
| 88.49944217181108 | 0.006 | -0.039 | -0.24 | 0.44 |
| 88.66679062848644 | -0.026 | 0 | -0.246 | 0.421 |
| 88.83413908516178 | -0.052 | 0.045 | -0.246 | 0.389 |
| 89.00148754183712 | -0.071 | 0.084 | -0.253 | 0.363 |
| 89.16883599851246 | -0.065 | 0.104 | -0.246 | 0.356 |
| 89.33618445518782 | -0.052 | 0.11 | -0.24 | 0.35 |
| 89.50353291186315 | -0.032 | 0.11 | -0.233 | 0.343 |
| 89.6708813685385 | -0.006 | 0.097 | -0.22 | 0.343 |
| 89.83822982521386 | 0.019 | 0.071 | -0.214 | 0.33 |
| 90.00557828188919 | 0.045 | 0.045 | -0.207 | 0.33 |
| 90.16362960208257 | 0.071 | 0.013 | -0.201 | 0.343 |
| 90.3309780587579 | 0.091 | -0.019 | -0.194 | 0.356 |
| 90.49832651543326 | 0.091 | -0.039 | -0.194 | 0.363 |
| 90.66567497210859 | 0.084 | -0.045 | -0.201 | 0.363 |
| 90.83302342878395 | 0.065 | -0.039 | -0.207 | 0.369 |
| 91.00037188545929 | 0.039 | -0.019 | -0.214 | 0.382 |
| 91.16772034213463 | 0.019 | 0.006 | -0.227 | 0.382 |
| 91.33506879880998 | -0.013 | 0.032 | -0.233 | 0.382 |
| 91.50241725548533 | -0.052 | 0.065 | -0.246 | 0.376 |
| 91.66976571216065 | -0.084 | 0.104 | -0.253 | 0.376 |
| 91.83711416883601 | -0.117 | 0.149 | -0.259 | 0.382 |
| 92.00446262551137 | -0.149 | 0.188 | -0.266 | 0.402 |
| 92.1718110821867 | -0.168 | 0.227 | -0.266 | 0.421 |
| 92.33915953886203 | -0.168 | 0.246 | -0.259 | 0.421 |
| 92.49721085905541 | -0.162 | 0.259 | -0.253 | 0.421 |
| 92.66455931573077 | -0.142 | 0.253 | -0.246 | 0.408 |
| 92.83190777240611 | -0.123 | 0.246 | -0.233 | 0.395 |
| 92.99925622908145 | -0.104 | 0.227 | -0.227 | 0.389 |
| 93.1666046857568 | -0.071 | 0.201 | -0.214 | 0.395 |
| 93.33395314243214 | -0.052 | 0.181 | -0.207 | 0.389 |
| 93.50130159910749 | -0.026 | 0.162 | -0.201 | 0.363 |
| 93.66865005578283 | -0.006 | 0.13 | -0.201 | 0.337 |
| 93.83599851245818 | 0 | 0.11 | -0.207 | 0.343 |
| 94.00334696913353 | 0.013 | 0.078 | -0.22 | 0.343 |
| 94.17069542580886 | 0.026 | 0.039 | -0.227 | 0.35 |
| 94.3380438824842 | 0.032 | 0.006 | -0.233 | 0.356 |
| 94.50539233915954 | 0.045 | -0.013 | -0.246 | 0.369 |
| 94.66344365935292 | 0.052 | -0.032 | -0.253 | 0.389 |
| 94.83079211602828 | 0.058 | -0.045 | -0.266 | 0.408 |
| 94.99814057270362 | 0.058 | -0.052 | -0.278 | 0.427 |
| 95.16548902937897 | 0.052 | -0.039 | -0.285 | 0.44 |
| 95.33283748605432 | 0.065 | -0.052 | -0.291 | 0.427 |
| 95.50018594272963 | 0.071 | -0.065 | -0.291 | 0.408 |
| 95.66753439940499 | 0.058 | -0.019 | -0.298 | 0.395 |
| 95.83488285608034 | 0.039 | 0.026 | -0.304 | 0.395 |
| 96.00223131275567 | 0.006 | 0.123 | -0.298 | 0.421 |
| 96.16957976943102 | -0.019 | 0.201 | -0.291 | 0.453 |
| 96.33692822610638 | -0.032 | 0.22 | -0.285 | 0.46 |
| 96.50427668278171 | -0.039 | 0.233 | -0.285 | 0.453 |
| 96.67162513945706 | -0.078 | 0.298 | -0.278 | 0.518 |
| 96.8389735961324 | -0.11 | 0.369 | -0.272 | 0.583 |
| 96.99702491632577 | -0.136 | 0.389 | -0.278 | 0.609 |
| 97.16437337300111 | -0.162 | 0.408 | -0.285 | 0.635 |
| 97.33172182967647 | -0.188 | 0.434 | -0.285 | 0.648 |
| 97.49907028635181 | -0.201 | 0.44 | -0.285 | 0.654 |
| 97.66641874302715 | -0.207 | 0.44 | -0.285 | 0.648 |
| 97.8337671997025 | -0.207 | 0.447 | -0.285 | 0.648 |
| 98.00111565637785 | -0.207 | 0.453 | -0.278 | 0.635 |
| 98.16846411305319 | -0.201 | 0.447 | -0.278 | 0.622 |
| 98.33581256972855 | -0.188 | 0.44 | -0.278 | 0.602 |
| 98.50316102640389 | -0.175 | 0.434 | -0.272 | 0.583 |
| 98.67050948307921 | -0.168 | 0.414 | -0.272 | 0.57 |
| 98.83785793975456 | -0.168 | 0.414 | -0.272 | 0.57 |
| 99.0052063964299 | -0.168 | 0.421 | -0.272 | 0.576 |
| 99.17255485310525 | -0.155 | 0.408 | -0.272 | 0.57 |
| 99.33060617329863 | -0.13 | 0.382 | -0.259 | 0.55 |
| 99.49795462997399 | -0.104 | 0.35 | -0.253 | 0.531 |
| 99.66530308664933 | -0.078 | 0.311 | -0.246 | 0.505 |
| 99.83265154332467 | -0.058 | 0.272 | -0.24 | 0.492 |
| 100.0 | -0.045 | 0.233 | -0.24 | 0.479 |